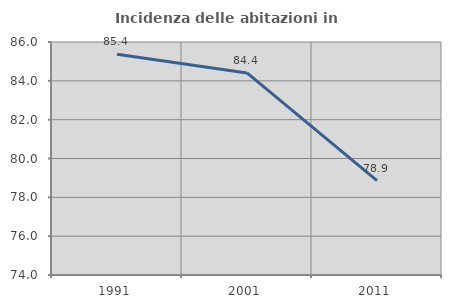
| Category | Incidenza delle abitazioni in proprietà  |
|---|---|
| 1991.0 | 85.366 |
| 2001.0 | 84.407 |
| 2011.0 | 78.859 |